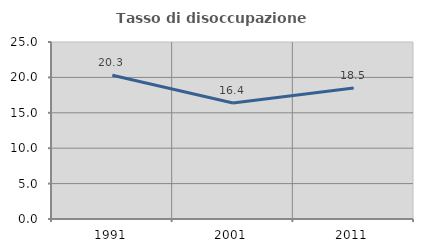
| Category | Tasso di disoccupazione giovanile  |
|---|---|
| 1991.0 | 20.297 |
| 2001.0 | 16.393 |
| 2011.0 | 18.519 |